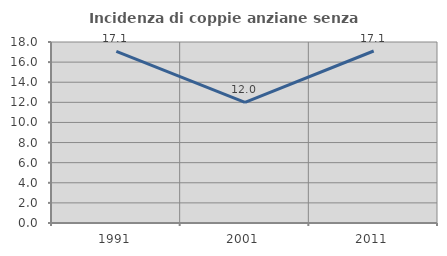
| Category | Incidenza di coppie anziane senza figli  |
|---|---|
| 1991.0 | 17.073 |
| 2001.0 | 12 |
| 2011.0 | 17.105 |